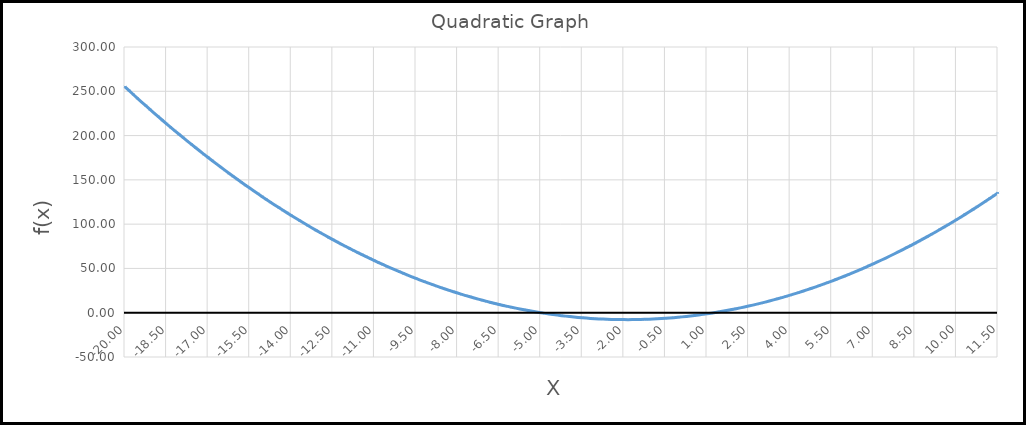
| Category | f(x) = a*x2 + b*x + c |
|---|---|
| -20.0 | 255 |
| -19.85 | 250.668 |
| -19.700000000000003 | 246.372 |
| -19.550000000000004 | 242.112 |
| -19.400000000000006 | 237.888 |
| -19.250000000000007 | 233.7 |
| -19.10000000000001 | 229.548 |
| -18.95000000000001 | 225.432 |
| -18.80000000000001 | 221.352 |
| -18.650000000000013 | 217.308 |
| -18.500000000000014 | 213.3 |
| -18.350000000000016 | 209.328 |
| -18.200000000000017 | 205.392 |
| -18.05000000000002 | 201.492 |
| -17.90000000000002 | 197.628 |
| -17.75000000000002 | 193.8 |
| -17.600000000000023 | 190.008 |
| -17.450000000000024 | 186.252 |
| -17.300000000000026 | 182.532 |
| -17.150000000000027 | 178.848 |
| -17.00000000000003 | 175.2 |
| -16.85000000000003 | 171.588 |
| -16.70000000000003 | 168.012 |
| -16.550000000000033 | 164.472 |
| -16.400000000000034 | 160.968 |
| -16.250000000000036 | 157.5 |
| -16.100000000000037 | 154.068 |
| -15.950000000000037 | 150.672 |
| -15.800000000000036 | 147.312 |
| -15.650000000000036 | 143.988 |
| -15.500000000000036 | 140.7 |
| -15.350000000000035 | 137.448 |
| -15.200000000000035 | 134.232 |
| -15.050000000000034 | 131.052 |
| -14.900000000000034 | 127.908 |
| -14.750000000000034 | 124.8 |
| -14.600000000000033 | 121.728 |
| -14.450000000000033 | 118.692 |
| -14.300000000000033 | 115.692 |
| -14.150000000000032 | 112.728 |
| -14.000000000000032 | 109.8 |
| -13.850000000000032 | 106.908 |
| -13.700000000000031 | 104.052 |
| -13.550000000000031 | 101.232 |
| -13.40000000000003 | 98.448 |
| -13.25000000000003 | 95.7 |
| -13.10000000000003 | 92.988 |
| -12.95000000000003 | 90.312 |
| -12.80000000000003 | 87.672 |
| -12.650000000000029 | 85.068 |
| -12.500000000000028 | 82.5 |
| -12.350000000000028 | 79.968 |
| -12.200000000000028 | 77.472 |
| -12.050000000000027 | 75.012 |
| -11.900000000000027 | 72.588 |
| -11.750000000000027 | 70.2 |
| -11.600000000000026 | 67.848 |
| -11.450000000000026 | 65.532 |
| -11.300000000000026 | 63.252 |
| -11.150000000000025 | 61.008 |
| -11.000000000000025 | 58.8 |
| -10.850000000000025 | 56.628 |
| -10.700000000000024 | 54.492 |
| -10.550000000000024 | 52.392 |
| -10.400000000000023 | 50.328 |
| -10.250000000000023 | 48.3 |
| -10.100000000000023 | 46.308 |
| -9.950000000000022 | 44.352 |
| -9.800000000000022 | 42.432 |
| -9.650000000000022 | 40.548 |
| -9.500000000000021 | 38.7 |
| -9.350000000000021 | 36.888 |
| -9.20000000000002 | 35.112 |
| -9.05000000000002 | 33.372 |
| -8.90000000000002 | 31.668 |
| -8.75000000000002 | 30 |
| -8.60000000000002 | 28.368 |
| -8.450000000000019 | 26.772 |
| -8.300000000000018 | 25.212 |
| -8.150000000000018 | 23.688 |
| -8.000000000000018 | 22.2 |
| -7.850000000000017 | 20.748 |
| -7.700000000000017 | 19.332 |
| -7.550000000000017 | 17.952 |
| -7.400000000000016 | 16.608 |
| -7.250000000000016 | 15.3 |
| -7.100000000000016 | 14.028 |
| -6.950000000000015 | 12.792 |
| -6.800000000000015 | 11.592 |
| -6.650000000000015 | 10.428 |
| -6.500000000000014 | 9.3 |
| -6.350000000000014 | 8.208 |
| -6.2000000000000135 | 7.152 |
| -6.050000000000013 | 6.132 |
| -5.900000000000013 | 5.148 |
| -5.750000000000012 | 4.2 |
| -5.600000000000012 | 3.288 |
| -5.450000000000012 | 2.412 |
| -5.300000000000011 | 1.572 |
| -5.150000000000011 | 0.768 |
| -5.000000000000011 | 0 |
| -4.85000000000001 | -0.732 |
| -4.70000000000001 | -1.428 |
| -4.55000000000001 | -2.088 |
| -4.400000000000009 | -2.712 |
| -4.250000000000009 | -3.3 |
| -4.1000000000000085 | -3.852 |
| -3.9500000000000086 | -4.368 |
| -3.8000000000000087 | -4.848 |
| -3.650000000000009 | -5.292 |
| -3.500000000000009 | -5.7 |
| -3.350000000000009 | -6.072 |
| -3.200000000000009 | -6.408 |
| -3.050000000000009 | -6.708 |
| -2.9000000000000092 | -6.972 |
| -2.7500000000000093 | -7.2 |
| -2.6000000000000094 | -7.392 |
| -2.4500000000000095 | -7.548 |
| -2.3000000000000096 | -7.668 |
| -2.1500000000000097 | -7.752 |
| -2.0000000000000098 | -7.8 |
| -1.8500000000000099 | -7.812 |
| -1.70000000000001 | -7.788 |
| -1.55000000000001 | -7.728 |
| -1.4000000000000101 | -7.632 |
| -1.2500000000000102 | -7.5 |
| -1.1000000000000103 | -7.332 |
| -0.9500000000000103 | -7.128 |
| -0.8000000000000103 | -6.888 |
| -0.6500000000000102 | -6.612 |
| -0.5000000000000102 | -6.3 |
| -0.3500000000000102 | -5.952 |
| -0.2000000000000102 | -5.568 |
| -0.0500000000000102 | -5.148 |
| 0.09999999999998979 | -4.692 |
| 0.24999999999998979 | -4.2 |
| 0.3999999999999898 | -3.672 |
| 0.5499999999999898 | -3.108 |
| 0.6999999999999899 | -2.508 |
| 0.8499999999999899 | -1.872 |
| 0.9999999999999899 | -1.2 |
| 1.14999999999999 | -0.492 |
| 1.2999999999999898 | 0.252 |
| 1.4499999999999897 | 1.032 |
| 1.5999999999999897 | 1.848 |
| 1.7499999999999896 | 2.7 |
| 1.8999999999999895 | 3.588 |
| 2.0499999999999896 | 4.512 |
| 2.1999999999999895 | 5.472 |
| 2.3499999999999894 | 6.468 |
| 2.4999999999999893 | 7.5 |
| 2.6499999999999893 | 8.568 |
| 2.799999999999989 | 9.672 |
| 2.949999999999989 | 10.812 |
| 3.099999999999989 | 11.988 |
| 3.249999999999989 | 13.2 |
| 3.399999999999989 | 14.448 |
| 3.5499999999999887 | 15.732 |
| 3.6999999999999886 | 17.052 |
| 3.8499999999999885 | 18.408 |
| 3.9999999999999885 | 19.8 |
| 4.149999999999989 | 21.228 |
| 4.299999999999989 | 22.692 |
| 4.4499999999999895 | 24.192 |
| 4.59999999999999 | 25.728 |
| 4.74999999999999 | 27.3 |
| 4.899999999999991 | 28.908 |
| 5.049999999999991 | 30.552 |
| 5.199999999999991 | 32.232 |
| 5.349999999999992 | 33.948 |
| 5.499999999999992 | 35.7 |
| 5.649999999999992 | 37.488 |
| 5.799999999999993 | 39.312 |
| 5.949999999999993 | 41.172 |
| 6.099999999999993 | 43.068 |
| 6.249999999999994 | 45 |
| 6.399999999999994 | 46.968 |
| 6.5499999999999945 | 48.972 |
| 6.699999999999995 | 51.012 |
| 6.849999999999995 | 53.088 |
| 6.999999999999996 | 55.2 |
| 7.149999999999996 | 57.348 |
| 7.299999999999996 | 59.532 |
| 7.449999999999997 | 61.752 |
| 7.599999999999997 | 64.008 |
| 7.749999999999997 | 66.3 |
| 7.899999999999998 | 68.628 |
| 8.049999999999997 | 70.992 |
| 8.199999999999998 | 73.392 |
| 8.349999999999998 | 75.828 |
| 8.499999999999998 | 78.3 |
| 8.649999999999999 | 80.808 |
| 8.799999999999999 | 83.352 |
| 8.95 | 85.932 |
| 9.1 | 88.548 |
| 9.25 | 91.2 |
| 9.4 | 93.888 |
| 9.55 | 96.612 |
| 9.700000000000001 | 99.372 |
| 9.850000000000001 | 102.168 |
| 10.000000000000002 | 105 |
| 10.150000000000002 | 107.868 |
| 10.300000000000002 | 110.772 |
| 10.450000000000003 | 113.712 |
| 10.600000000000003 | 116.688 |
| 10.750000000000004 | 119.7 |
| 10.900000000000004 | 122.748 |
| 11.050000000000004 | 125.832 |
| 11.200000000000005 | 128.952 |
| 11.350000000000005 | 132.108 |
| 11.500000000000005 | 135.3 |